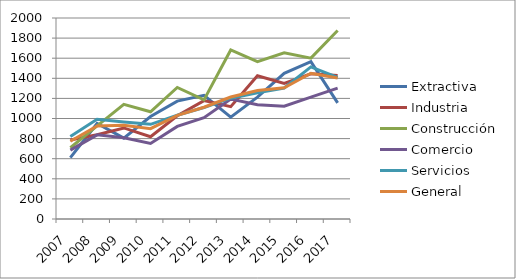
| Category | Extractiva  | Industria | Construcción | Comercio | Servicios | General |
|---|---|---|---|---|---|---|
| 2007.0 | 611 | 787 | 709 | 685 | 820 | 773 |
| 2008.0 | 950 | 838 | 926 | 837 | 992 | 925 |
| 2009.0 | 805 | 906 | 1141 | 808 | 965 | 932 |
| 2010.0 | 1020 | 818 | 1067 | 751 | 942 | 899 |
| 2011.0 | 1173 | 1027 | 1309 | 921 | 1032 | 1032 |
| 2012.0 | 1230 | 1178 | 1185 | 1008 | 1109 | 1112 |
| 2013.0 | 1014 | 1118 | 1682 | 1194 | 1202 | 1214 |
| 2014.0 | 1213 | 1425 | 1566 | 1137 | 1257 | 1279 |
| 2015.0 | 1449 | 1348 | 1654 | 1122 | 1303 | 1306 |
| 2016.0 | 1565 | 1445 | 1601 | 1212 | 1514 | 1450 |
| 2017.0 | 1155 | 1428 | 1876 | 1302 | 1408 | 1403 |